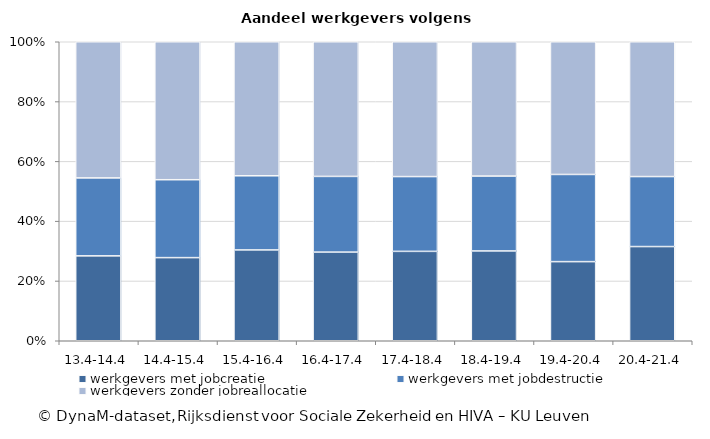
| Category | werkgevers met jobcreatie | werkgevers met jobdestructie | werkgevers zonder jobreallocatie  |
|---|---|---|---|
| 20.4-21.4 | 31.505 | 23.412 | 45.083 |
| 19.4-20.4 | 26.459 | 29.163 | 44.377 |
| 18.4-19.4 | 30.033 | 25.048 | 44.919 |
| 17.4-18.4 | 29.899 | 25.01 | 45.091 |
| 16.4-17.4 | 29.655 | 25.31 | 45.035 |
| 15.4-16.4 | 30.374 | 24.802 | 44.824 |
| 14.4-15.4 | 27.802 | 26.055 | 46.143 |
| 13.4-14.4 | 28.395 | 26.07 | 45.535 |